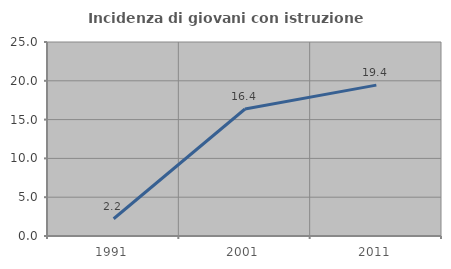
| Category | Incidenza di giovani con istruzione universitaria |
|---|---|
| 1991.0 | 2.222 |
| 2001.0 | 16.364 |
| 2011.0 | 19.444 |